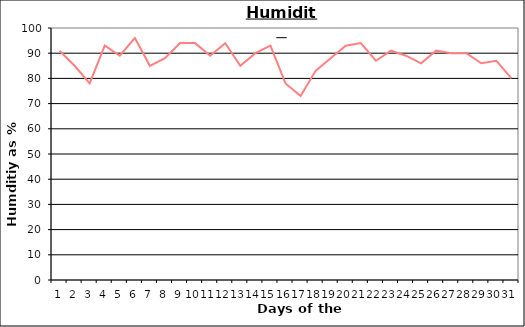
| Category | Series 0 |
|---|---|
| 0 | 91 |
| 1 | 85 |
| 2 | 78 |
| 3 | 93 |
| 4 | 89 |
| 5 | 96 |
| 6 | 85 |
| 7 | 88 |
| 8 | 94 |
| 9 | 94 |
| 10 | 89 |
| 11 | 94 |
| 12 | 85 |
| 13 | 90 |
| 14 | 93 |
| 15 | 78 |
| 16 | 73 |
| 17 | 83 |
| 18 | 88 |
| 19 | 93 |
| 20 | 94 |
| 21 | 87 |
| 22 | 91 |
| 23 | 89 |
| 24 | 86 |
| 25 | 91 |
| 26 | 90 |
| 27 | 90 |
| 28 | 86 |
| 29 | 87 |
| 30 | 80 |